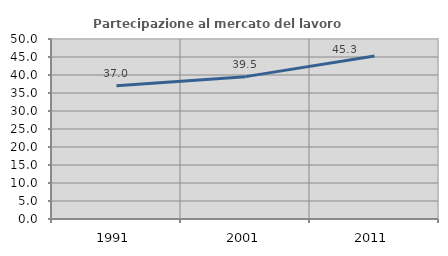
| Category | Partecipazione al mercato del lavoro  femminile |
|---|---|
| 1991.0 | 37.047 |
| 2001.0 | 39.547 |
| 2011.0 | 45.258 |